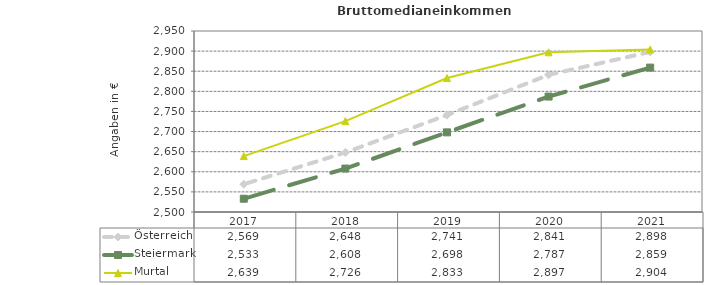
| Category | Österreich | Steiermark | Murtal |
|---|---|---|---|
| 2021.0 | 2898 | 2859 | 2904 |
| 2020.0 | 2841 | 2787 | 2897 |
| 2019.0 | 2741 | 2698 | 2833 |
| 2018.0 | 2648 | 2608 | 2726 |
| 2017.0 | 2569 | 2533 | 2639 |